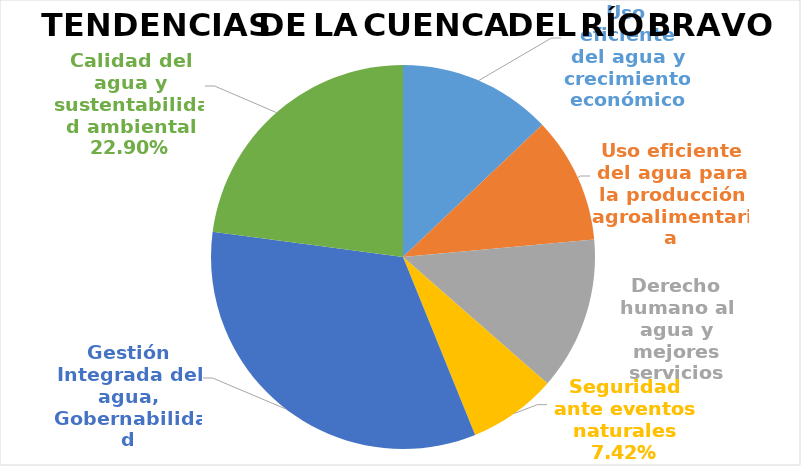
| Category | Series 0 |
|---|---|
| Uso eficiente del agua y crecimiento económico | 40 |
| Uso eficiente del agua para la producción agroalimentaria | 33 |
| Derecho humano al agua y mejores servicios | 40 |
| Seguridad ante eventos naturales | 23 |
| Gestión Integrada del agua, Gobernabilidad | 103 |
| Calidad del agua y sustentabilidad ambiental | 71 |